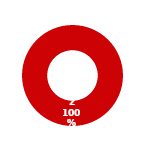
| Category | PROGRAM |
|---|---|
| MIL 1 Complete | 0 |
| MIL 1 Not Complete | 2 |